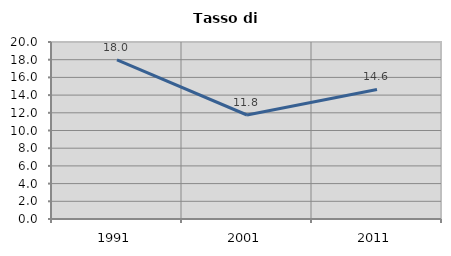
| Category | Tasso di disoccupazione   |
|---|---|
| 1991.0 | 17.976 |
| 2001.0 | 11.752 |
| 2011.0 | 14.643 |